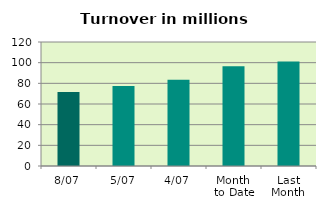
| Category | Series 0 |
|---|---|
| 8/07 | 71.601 |
| 5/07 | 77.327 |
| 4/07 | 83.444 |
| Month 
to Date | 96.589 |
| Last
Month | 101.166 |